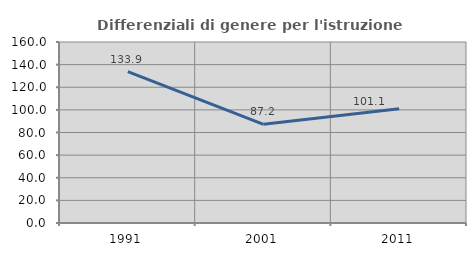
| Category | Differenziali di genere per l'istruzione superiore |
|---|---|
| 1991.0 | 133.857 |
| 2001.0 | 87.209 |
| 2011.0 | 101.071 |